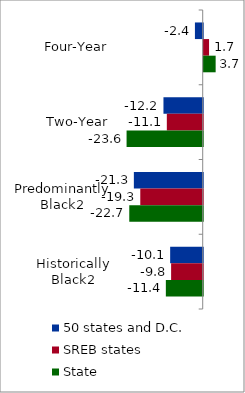
| Category | 50 states and D.C. | SREB states | State |
|---|---|---|---|
| Four-Year | -2.413 | 1.656 | 3.695 |
| Two-Year | -12.158 | -11.115 | -23.582 |
| Predominantly Black2 | -21.326 | -19.339 | -22.749 |
| Historically Black2 | -10.083 | -9.788 | -11.419 |